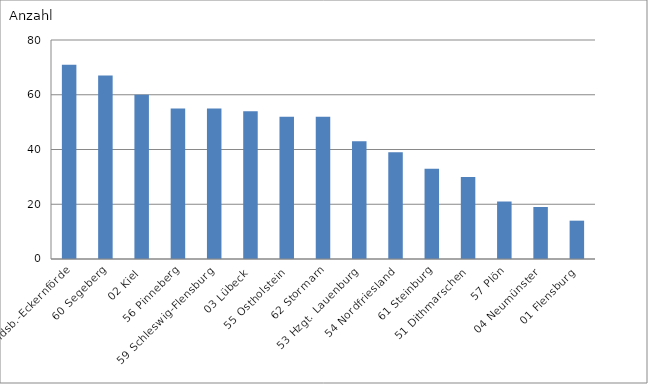
| Category | 58 Rendsb.-Eckernförde |
|---|---|
| 58 Rendsb.-Eckernförde | 71 |
| 60 Segeberg | 67 |
| 02 Kiel | 60 |
| 56 Pinneberg | 55 |
| 59 Schleswig-Flensburg | 55 |
| 03 Lübeck | 54 |
| 55 Ostholstein | 52 |
| 62 Stormarn | 52 |
| 53 Hzgt. Lauenburg | 43 |
| 54 Nordfriesland | 39 |
| 61 Steinburg | 33 |
| 51 Dithmarschen | 30 |
| 57 Plön | 21 |
| 04 Neumünster | 19 |
| 01 Flensburg | 14 |